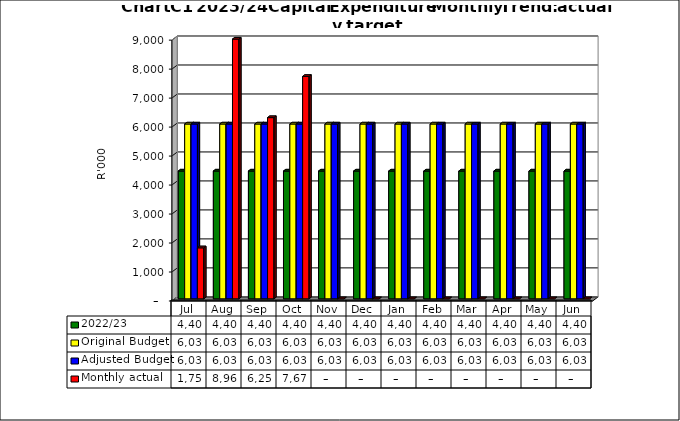
| Category | 2022/23 | Original Budget | Adjusted Budget | Monthly actual |
|---|---|---|---|---|
| Jul | 4409242.68 | 6031695.82 | 6031706 | 1759374.9 |
| Aug | 4409242.68 | 6031695.82 | 6031706 | 8961182.31 |
| Sep | 4409242.68 | 6031695.82 | 6031706 | 6251636.02 |
| Oct | 4409242.68 | 6031695.82 | 6031706 | 7671938.68 |
| Nov | 4409242.68 | 6031695.82 | 6031706 | 0 |
| Dec | 4409242.68 | 6031695.82 | 6031706 | 0 |
| Jan | 4409242.68 | 6031695.82 | 6031706 | 0 |
| Feb | 4409242.68 | 6031695.82 | 6031706 | 0 |
| Mar | 4409242.68 | 6031695.82 | 6031706 | 0 |
| Apr | 4409242.68 | 6031695.82 | 6031706 | 0 |
| May | 4409242.68 | 6031695.82 | 6031706 | 0 |
| Jun | 4409242.58 | 6031695.98 | 6031584 | 0 |